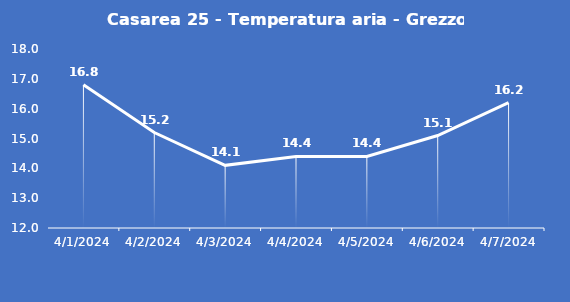
| Category | Casarea 25 - Temperatura aria - Grezzo (°C) |
|---|---|
| 4/1/24 | 16.8 |
| 4/2/24 | 15.2 |
| 4/3/24 | 14.1 |
| 4/4/24 | 14.4 |
| 4/5/24 | 14.4 |
| 4/6/24 | 15.1 |
| 4/7/24 | 16.2 |